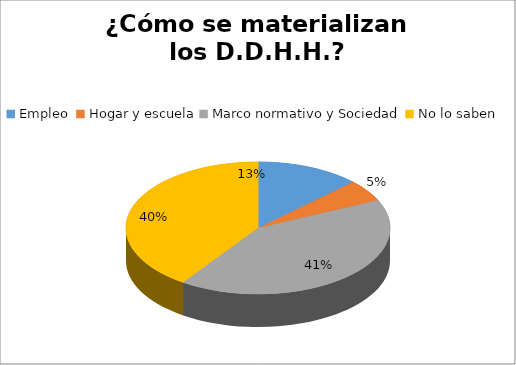
| Category | Series 0 |
|---|---|
| Empleo  | 12 |
| Hogar y escuela | 5 |
| Marco normativo y Sociedad | 39 |
| No lo saben | 38 |